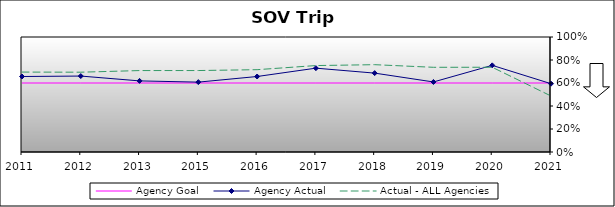
| Category | Agency Goal | Agency Actual | Actual - ALL Agencies |
|---|---|---|---|
| 2011.0 | 0.6 | 0.656 | 0.695 |
| 2012.0 | 0.6 | 0.66 | 0.694 |
| 2013.0 | 0.6 | 0.618 | 0.708 |
| 2015.0 | 0.6 | 0.608 | 0.708 |
| 2016.0 | 0.6 | 0.656 | 0.716 |
| 2017.0 | 0.6 | 0.729 | 0.752 |
| 2018.0 | 0.6 | 0.686 | 0.759 |
| 2019.0 | 0.6 | 0.609 | 0.736 |
| 2020.0 | 0.6 | 0.754 | 0.737 |
| 2021.0 | 0.6 | 0.594 | 0.487 |